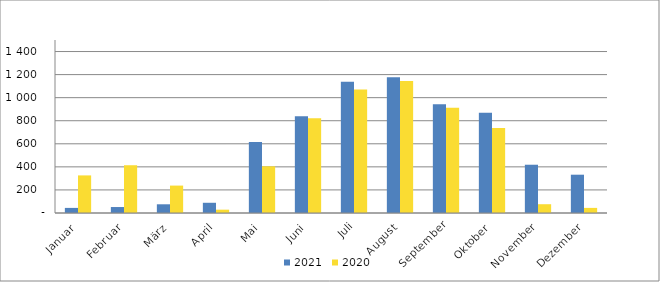
| Category | 2021 | 2020 |
|---|---|---|
| Januar | 44193 | 325980 |
| Februar | 51745 | 414127 |
| März | 75543 | 237668 |
| April | 88628 | 28867 |
| Mai | 616132 | 404870 |
| Juni | 839169 | 820867 |
| Juli | 1137664 | 1070071 |
| August | 1177969 | 1144363 |
| September | 942037 | 913446 |
| Oktober | 870056 | 736892 |
| November | 418550 | 76148 |
| Dezember | 332107 | 44298 |